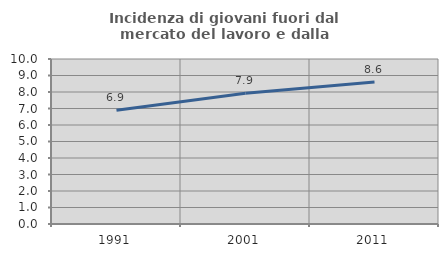
| Category | Incidenza di giovani fuori dal mercato del lavoro e dalla formazione  |
|---|---|
| 1991.0 | 6.897 |
| 2001.0 | 7.923 |
| 2011.0 | 8.607 |